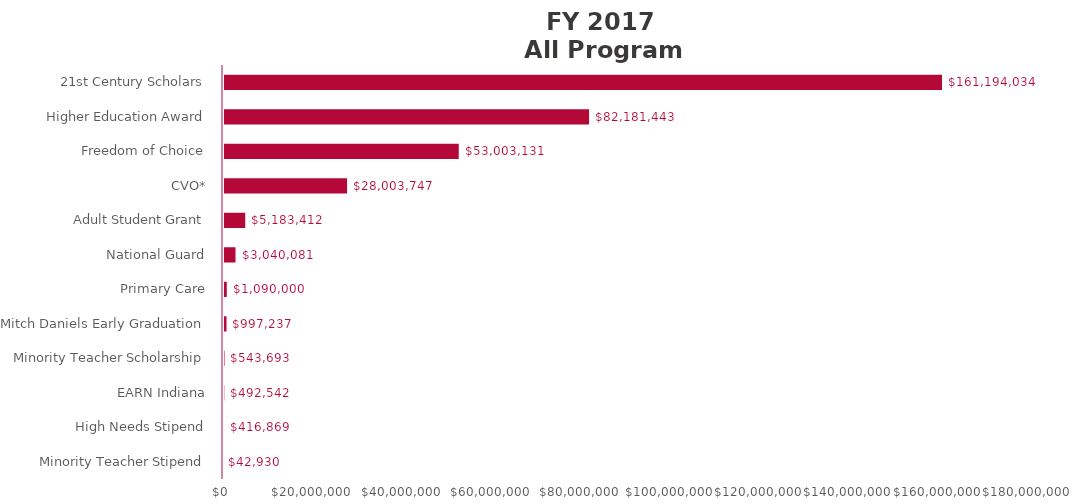
| Category | Series 0 |
|---|---|
| Minority Teacher Stipend | 42929.67 |
| High Needs Stipend | 416869.44 |
| EARN Indiana | 492542.33 |
| Minority Teacher Scholarship | 543693 |
| Mitch Daniels Early Graduation | 997236.5 |
| Primary Care | 1090000 |
| National Guard | 3040080.8 |
| Adult Student Grant | 5183412 |
| CVO* | 28003747.42 |
| Freedom of Choice | 53003131 |
| Higher Education Award | 82181443 |
| 21st Century Scholars | 161194034 |